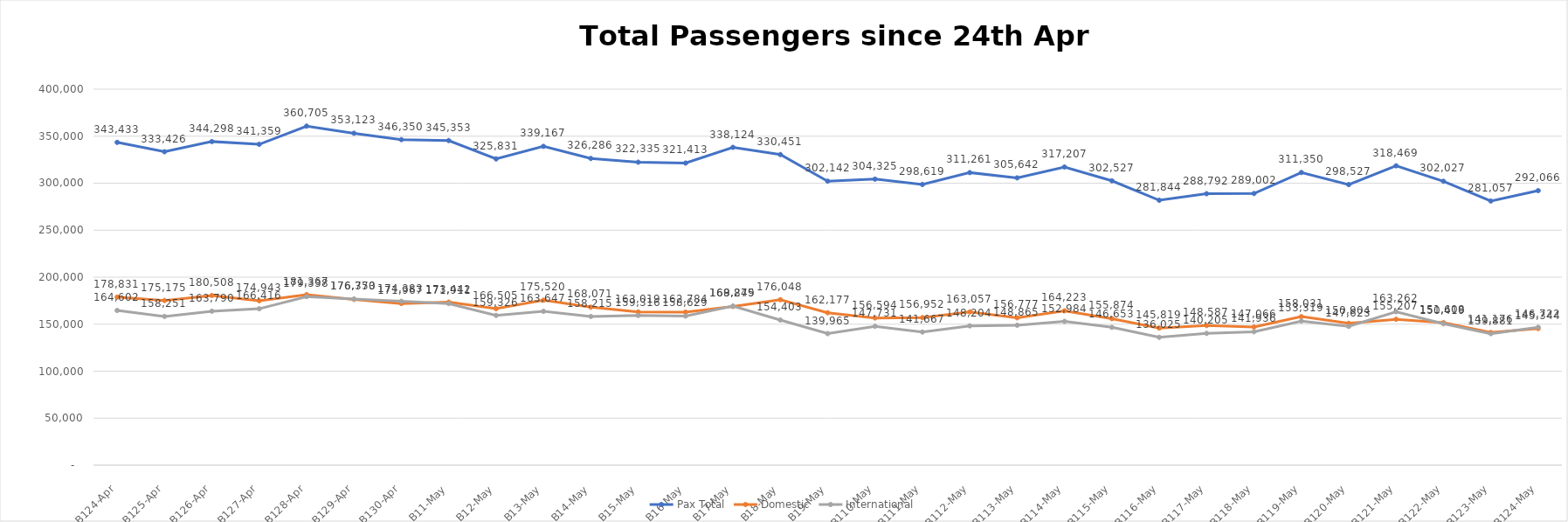
| Category | Pax Total |  Domestic  |  International  |
|---|---|---|---|
| 2023-04-24 | 343433 | 178831 | 164602 |
| 2023-04-25 | 333426 | 175175 | 158251 |
| 2023-04-26 | 344298 | 180508 | 163790 |
| 2023-04-27 | 341359 | 174943 | 166416 |
| 2023-04-28 | 360705 | 181367 | 179338 |
| 2023-04-29 | 353123 | 176373 | 176750 |
| 2023-04-30 | 346350 | 171967 | 174383 |
| 2023-05-01 | 345353 | 173442 | 171911 |
| 2023-05-02 | 325831 | 166505 | 159326 |
| 2023-05-03 | 339167 | 175520 | 163647 |
| 2023-05-04 | 326286 | 168071 | 158215 |
| 2023-05-05 | 322335 | 163019 | 159316 |
| 2023-05-06 | 321413 | 162784 | 158629 |
| 2023-05-07 | 338124 | 168849 | 169275 |
| 2023-05-08 | 330451 | 176048 | 154403 |
| 2023-05-09 | 302142 | 162177 | 139965 |
| 2023-05-10 | 304325 | 156594 | 147731 |
| 2023-05-11 | 298619 | 156952 | 141667 |
| 2023-05-12 | 311261 | 163057 | 148204 |
| 2023-05-13 | 305642 | 156777 | 148865 |
| 2023-05-14 | 317207 | 164223 | 152984 |
| 2023-05-15 | 302527 | 155874 | 146653 |
| 2023-05-16 | 281844 | 145819 | 136025 |
| 2023-05-17 | 288792 | 148587 | 140205 |
| 2023-05-18 | 289002 | 147066 | 141936 |
| 2023-05-19 | 311350 | 158031 | 153319 |
| 2023-05-20 | 298527 | 150904 | 147623 |
| 2023-05-21 | 318469 | 155207 | 163262 |
| 2023-05-22 | 302027 | 151608 | 150419 |
| 2023-05-23 | 281057 | 141176 | 139881 |
| 2023-05-24 | 292066 | 145344 | 146722 |